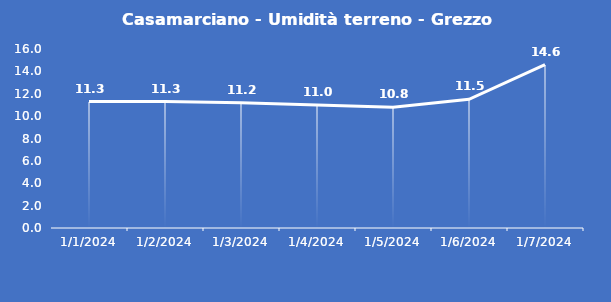
| Category | Casamarciano - Umidità terreno - Grezzo (%VWC) |
|---|---|
| 1/1/24 | 11.3 |
| 1/2/24 | 11.3 |
| 1/3/24 | 11.2 |
| 1/4/24 | 11 |
| 1/5/24 | 10.8 |
| 1/6/24 | 11.5 |
| 1/7/24 | 14.6 |